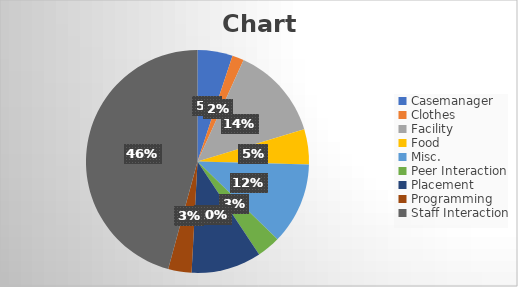
| Category | Series 0 |
|---|---|
| Casemanager | 3 |
| Clothes | 1 |
| Facility | 8 |
| Food | 3 |
| Misc. | 7 |
| Peer Interaction | 2 |
| Placement | 6 |
| Programming | 2 |
| Staff Interaction | 27 |